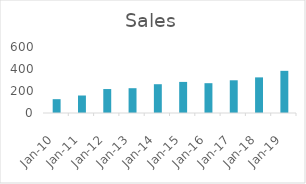
| Category |  Sales  |
|---|---|
| 2010-03-31 | 125.71 |
| 2011-03-31 | 159.01 |
| 2012-03-31 | 217.82 |
| 2013-03-31 | 225.45 |
| 2014-03-31 | 261.7 |
| 2015-03-31 | 282.58 |
| 2016-03-31 | 271.03 |
| 2017-03-31 | 297.41 |
| 2018-03-31 | 323.82 |
| 2019-03-31 | 383.29 |